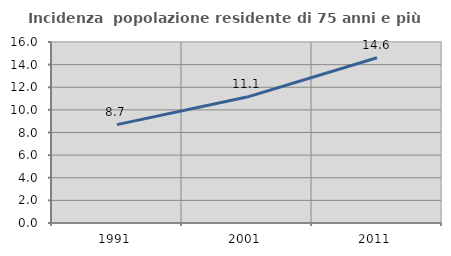
| Category | Incidenza  popolazione residente di 75 anni e più |
|---|---|
| 1991.0 | 8.697 |
| 2001.0 | 11.131 |
| 2011.0 | 14.609 |